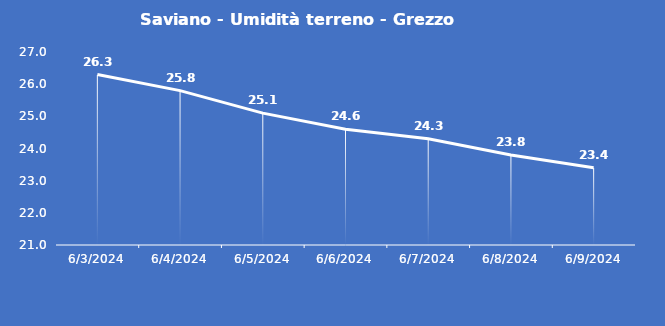
| Category | Saviano - Umidità terreno - Grezzo (%VWC) |
|---|---|
| 6/3/24 | 26.3 |
| 6/4/24 | 25.8 |
| 6/5/24 | 25.1 |
| 6/6/24 | 24.6 |
| 6/7/24 | 24.3 |
| 6/8/24 | 23.8 |
| 6/9/24 | 23.4 |